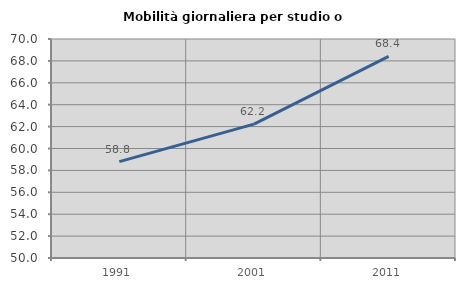
| Category | Mobilità giornaliera per studio o lavoro |
|---|---|
| 1991.0 | 58.805 |
| 2001.0 | 62.225 |
| 2011.0 | 68.421 |